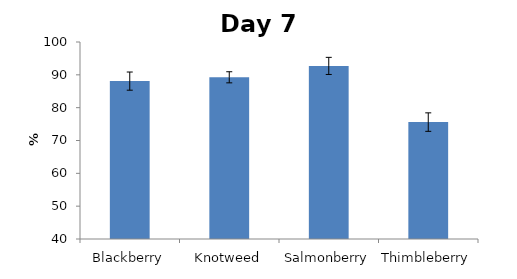
| Category | Series 0 |
|---|---|
| Blackberry | 88.089 |
| Knotweed | 89.249 |
| Salmonberry | 92.719 |
| Thimbleberry | 75.607 |